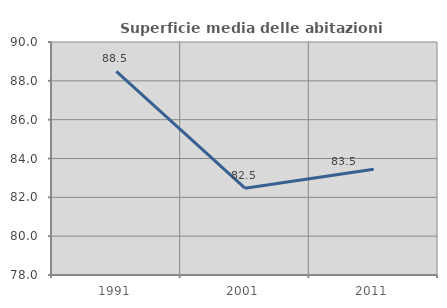
| Category | Superficie media delle abitazioni occupate |
|---|---|
| 1991.0 | 88.483 |
| 2001.0 | 82.473 |
| 2011.0 | 83.452 |